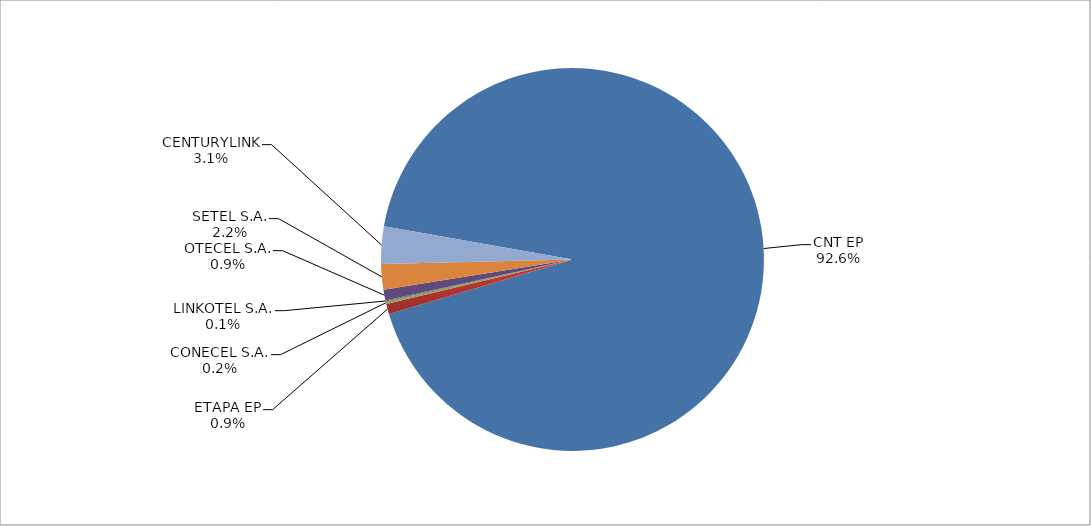
| Category | Series 0 |
|---|---|
| CNT EP | 2799 |
| ETAPA EP | 26 |
| CONECEL S.A. | 7 |
| LINKOTEL S.A. | 2 |
| OTECEL S.A. | 28 |
| SETEL S.A. | 65 |
| CENTURYLINK | 95 |